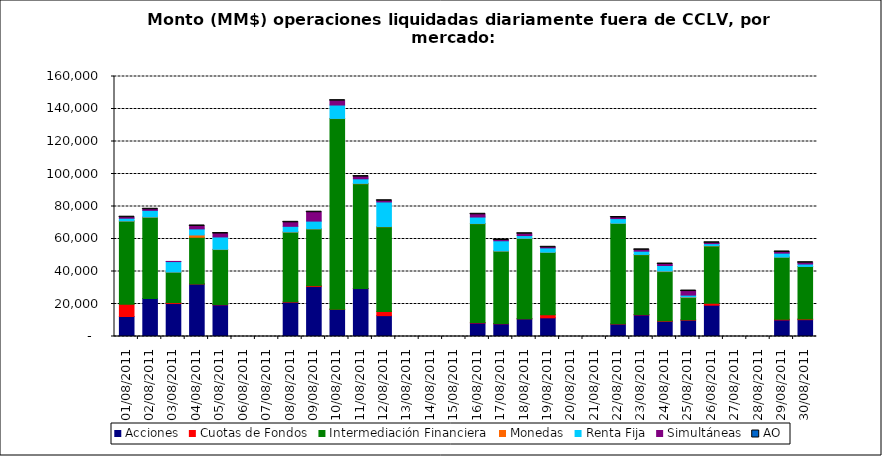
| Category | Acciones | Cuotas de Fondos | Intermediación Financiera | Monedas | Renta Fija | Simultáneas | AO |
|---|---|---|---|---|---|---|---|
| 01/08/2011 | 12311.715 | 7499.055 | 51225.204 | 78.522 | 1681.702 | 610.452 | 0.073 |
| 02/08/2011 | 23367.067 | 0 | 50016.046 | 155.634 | 4079.604 | 679.454 | 0.023 |
| 03/08/2011 | 20270.891 | 567.726 | 18783.577 | 40.95 | 6443.087 | 94.38 | 0 |
| 04/08/2011 | 32303.174 | 43.502 | 28708.134 | 1435.08 | 3736.742 | 1795.568 | 0.563 |
| 05/08/2011 | 19503.745 | 204.149 | 33792.04 | 162.525 | 7609.022 | 2093.55 | 0.225 |
| 08/08/2011 | 21129.247 | 226.241 | 42881.363 | 116.341 | 3447.851 | 2451.04 | 0.246 |
| 09/08/2011 | 30741.96 | 508.643 | 34971.472 | 79.917 | 4712.927 | 5469.209 | 0.093 |
| 10/08/2011 | 16763.097 | 59.77 | 117261.958 | 107.524 | 8244.218 | 2696.589 | 0.012 |
| 11/08/2011 | 29494.815 | 12.406 | 64500.758 | 220.081 | 2807.33 | 1353.046 | 0.161 |
| 12/08/2011 | 12834.512 | 2508.402 | 52191.701 | 133.761 | 15129.916 | 733.495 | 0.027 |
| 16/08/2011 | 8333.683 | 207.471 | 60893.445 | 141.5 | 3947.792 | 1681.969 | 0.037 |
| 17/08/2011 | 7826.648 | 123.78 | 44598.299 | 86.61 | 6279.423 | 486.187 | 0.147 |
| 18/08/2011 | 10902.669 | 59.349 | 49339.71 | 159.653 | 1647.747 | 1125.63 | 0.246 |
| 19/08/2011 | 11494.556 | 1952.334 | 38302.704 | 92.24 | 2693.263 | 349.638 | 0.08 |
| 22/08/2011 | 7687.856 | 103.068 | 61808.753 | 108.623 | 2844.215 | 672.585 | 0.23 |
| 23/08/2011 | 13311.661 | 246.773 | 36780.801 | 163.866 | 2015.259 | 803.354 | 0.126 |
| 24/08/2011 | 9338.249 | 285.22 | 30316.153 | 283.531 | 3471.141 | 894.333 | 0.067 |
| 25/08/2011 | 10054.961 | 256.654 | 13662.968 | 318.723 | 1175.857 | 2501.672 | 0.145 |
| 26/08/2011 | 19266.818 | 1213.779 | 35257.468 | 138.429 | 1263.78 | 521.231 | 1.041 |
| 29/08/2011 | 10201.609 | 398.333 | 38209.571 | 39.401 | 2451.623 | 718.967 | 0.171 |
| 30/08/2011 | 10363.676 | 440.452 | 32259.906 | 50.823 | 1495.172 | 796.938 | 0.148 |